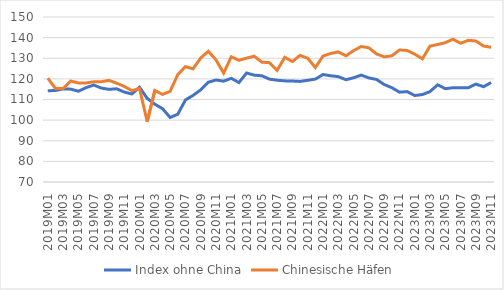
| Category | Index ohne China | Chinesische Häfen |
|---|---|---|
| 2019M01 | 114.218 | 120.331 |
| 2019M02 | 114.383 | 115.33 |
| 2019M03 | 115.126 | 115.271 |
| 2019M04 | 115.027 | 118.928 |
| 2019M05 | 114.009 | 118.028 |
| 2019M06 | 115.736 | 118.019 |
| 2019M07 | 117.025 | 118.595 |
| 2019M08 | 115.535 | 118.623 |
| 2019M09 | 114.927 | 119.269 |
| 2019M10 | 115.194 | 117.935 |
| 2019M11 | 113.601 | 116.349 |
| 2019M12 | 112.688 | 114.29 |
| 2020M01 | 115.929 | 115.305 |
| 2020M02 | 110.538 | 99.271 |
| 2020M03 | 107.728 | 114.369 |
| 2020M04 | 105.562 | 112.483 |
| 2020M05 | 101.29 | 113.97 |
| 2020M06 | 102.865 | 122.092 |
| 2020M07 | 109.764 | 125.945 |
| 2020M08 | 111.985 | 124.845 |
| 2020M09 | 114.668 | 130.105 |
| 2020M10 | 118.376 | 133.378 |
| 2020M11 | 119.44 | 129.219 |
| 2020M12 | 118.911 | 122.814 |
| 2021M01 | 120.265 | 130.735 |
| 2021M02 | 118.21 | 129.009 |
| 2021M03 | 122.844 | 130.047 |
| 2021M04 | 121.806 | 130.999 |
| 2021M05 | 121.502 | 128.104 |
| 2021M06 | 119.863 | 127.859 |
| 2021M07 | 119.358 | 124.154 |
| 2021M08 | 119.034 | 130.459 |
| 2021M09 | 118.954 | 128.407 |
| 2021M10 | 118.759 | 131.396 |
| 2021M11 | 119.313 | 130.001 |
| 2021M12 | 119.896 | 125.481 |
| 2022M01 | 122.115 | 131.068 |
| 2022M02 | 121.503 | 132.32 |
| 2022M03 | 121.084 | 133.071 |
| 2022M04 | 119.586 | 131.176 |
| 2022M05 | 120.532 | 133.69 |
| 2022M06 | 121.833 | 135.697 |
| 2022M07 | 120.449 | 135.058 |
| 2022M08 | 119.726 | 132.098 |
| 2022M09 | 117.275 | 130.69 |
| 2022M10 | 115.727 | 131.157 |
| 2022M11 | 113.559 | 134.011 |
| 2022M12 | 113.816 | 133.788 |
| 2023M01 | 111.938 | 132.006 |
| 2023M02 | 112.397 | 129.717 |
| 2023M03 | 113.845 | 135.882 |
| 2023M04 | 117.124 | 136.666 |
| 2023M05 | 115.248 | 137.559 |
| 2023M06 | 115.686 | 139.239 |
| 2023M07 | 115.751 | 137.265 |
| 2023M08 | 115.689 | 138.685 |
| 2023M09 | 117.482 | 138.372 |
| 2023M10 | 116.213 | 135.929 |
| 2023M11 | 118.199 | 135.313 |